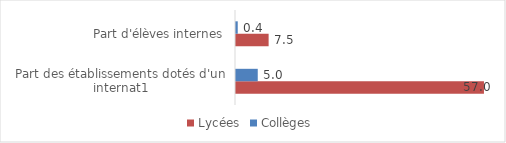
| Category | Lycées | Collèges |
|---|---|---|
| Part des établissements dotés d'un internat1 | 57 | 5 |
| Part d'élèves internes | 7.5 | 0.4 |